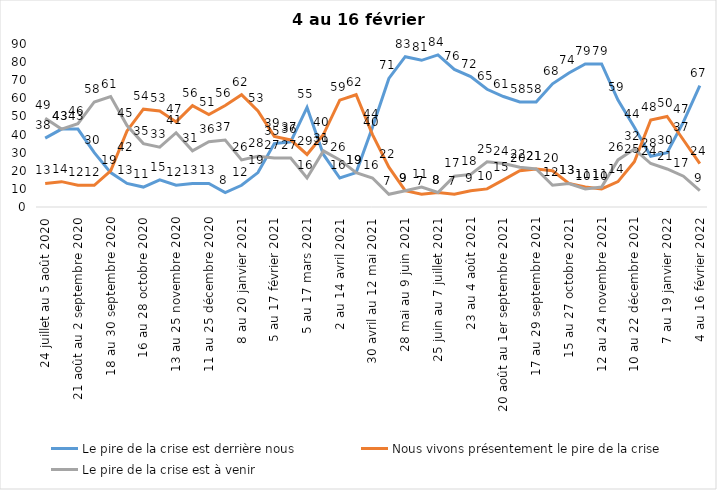
| Category | Le pire de la crise est derrière nous | Nous vivons présentement le pire de la crise | Le pire de la crise est à venir |
|---|---|---|---|
| 24 juillet au 5 août 2020 | 38 | 13 | 49 |
| 7 au 19 août 2020 | 43 | 14 | 43 |
| 21 août au 2 septembre 2020 | 43 | 12 | 46 |
| 4 au 16 septembre 2020 | 30 | 12 | 58 |
| 18 au 30 septembre 2020 | 19 | 20 | 61 |
| 2 au 14 octobre 2020 | 13 | 42 | 45 |
| 16 au 28 octobre 2020 | 11 | 54 | 35 |
| 30 octobre au 11 novembre 2020 | 15 | 53 | 33 |
| 13 au 25 novembre 2020 | 12 | 47 | 41 |
| 27 au 9 décembre 2020 | 13 | 56 | 31 |
| 11 au 25 décembre 2020 | 13 | 51 | 36 |
| 25 décembre 2020 au 6 janvier 2021 | 8 | 56 | 37 |
| 8 au 20 janvier 2021 | 12 | 62 | 26 |
| 22 janvier au 3 février 2021 | 19 | 53 | 28 |
| 5 au 17 février 2021 | 35 | 39 | 27 |
| 19 février au 3 mars 2021 | 36 | 37 | 27 |
| 5 au 17 mars 2021 | 55 | 29 | 16 |
| 19 au 31 mars 2021 | 29 | 40 | 31 |
| 2 au 14 avril 2021 | 16 | 59 | 26 |
| 16 au 28 avril 2021 | 19 | 62 | 19 |
| 30 avril au 12 mai 2021 | 44 | 40 | 16 |
| 14 au 26 mai 2021 | 71 | 22 | 7 |
| 28 mai au 9 juin 2021 | 83 | 9 | 9 |
| 11 au 23 juin 2021 | 81 | 7 | 11 |
| 25 juin au 7 juillet 2021 | 84 | 8 | 8 |
| 9 au 21 juillet 2021 | 76 | 7 | 17 |
| 23 au 4 août 2021 | 72 | 9 | 18 |
| 6 au 18 août 2021 | 65 | 10 | 25 |
| 20 août au 1er septembre 2021 | 61 | 15 | 24 |
| 3 au 15 septembre 2021 | 58 | 20 | 22 |
| 17 au 29 septembre 2021 | 58 | 21 | 21 |
| 1 au 13 octobre 2021 | 68 | 20 | 12 |
| 15 au 27 octobre 2021 | 74 | 13 | 13 |
| 29 octobre au 10 novembre 2021 | 79 | 11 | 10 |
| 12 au 24 novembre 2021 | 79 | 10 | 11 |
| 26 novembre au 8 décembre 2021 | 59 | 14 | 26 |
| 10 au 22 décembre 2021 | 44 | 25 | 32 |
| 24 décembre 2021 au 5 janvier 2022 | 28 | 48 | 24 |
| 7 au 19 janvier 2022 | 30 | 50 | 21 |
| 21 janvier au 2 février 2022 | 47 | 37 | 17 |
| 4 au 16 février 2022 | 67 | 24 | 9 |